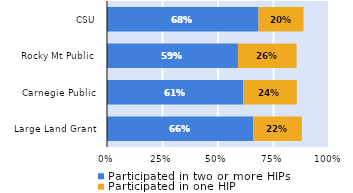
| Category | Participated in two or more HIPs | Participated in one HIP |
|---|---|---|
| Large Land Grant | 0.659 | 0.219 |
| Carnegie Public | 0.613 | 0.242 |
| Rocky Mt Public | 0.59 | 0.264 |
| CSU | 0.682 | 0.203 |